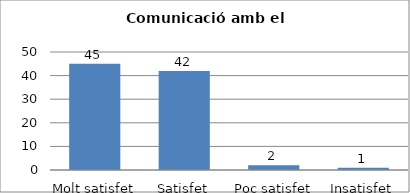
| Category | Series 0 |
|---|---|
| Molt satisfet | 45 |
| Satisfet | 42 |
| Poc satisfet | 2 |
| Insatisfet | 1 |